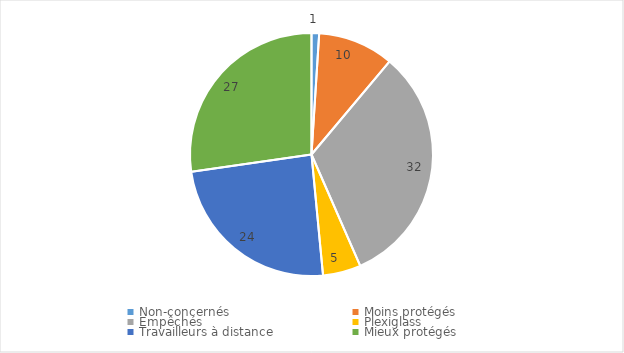
| Category | Series 0 |
|---|---|
| Non-concernés | 1 |
| Moins protégés | 10 |
| Empêchés | 32 |
| Plexiglass | 5 |
| Travailleurs à distance | 24 |
| Mieux protégés | 27 |